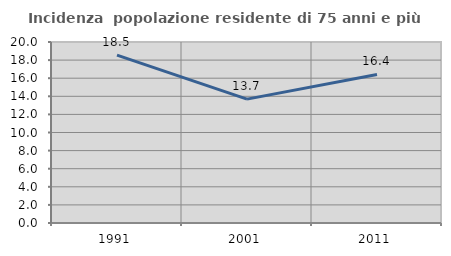
| Category | Incidenza  popolazione residente di 75 anni e più |
|---|---|
| 1991.0 | 18.545 |
| 2001.0 | 13.689 |
| 2011.0 | 16.411 |